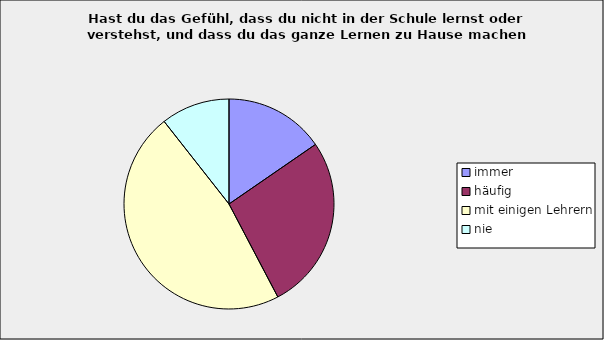
| Category | Series 0 |
|---|---|
| immer | 0.154 |
| häufig | 0.269 |
| mit einigen Lehrern | 0.471 |
| nie | 0.106 |